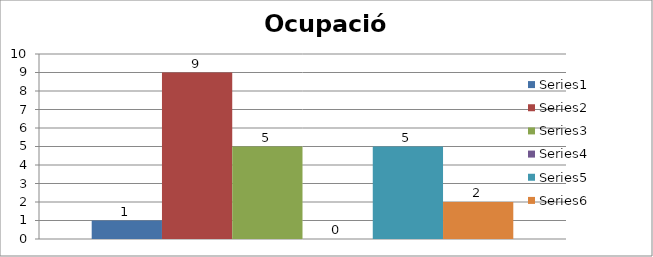
| Category | Series 0 | Series 1 | Series 2 | Series 3 | Series 4 | Series 5 |
|---|---|---|---|---|---|---|
| 0 | 1 | 9 | 5 | 0 | 5 | 2 |